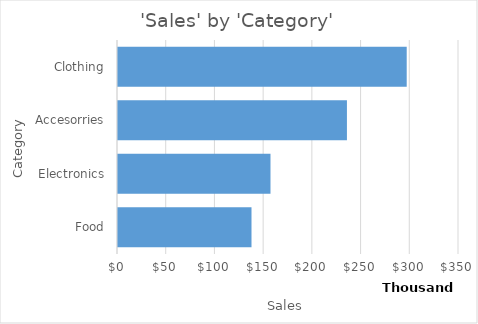
| Category | Total |
|---|---|
| Clothing | 296334 |
| Accesorries | 234978 |
| Electronics | 156511 |
| Food | 137021 |